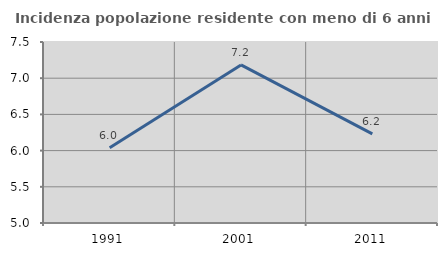
| Category | Incidenza popolazione residente con meno di 6 anni |
|---|---|
| 1991.0 | 6.04 |
| 2001.0 | 7.183 |
| 2011.0 | 6.23 |